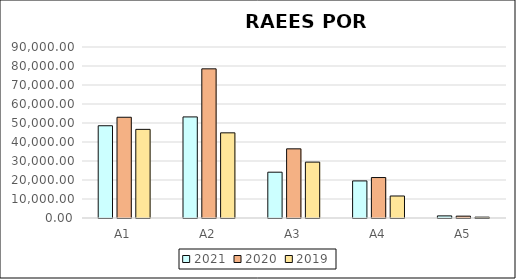
| Category | 2021 | 2020 | 2019 |
|---|---|---|---|
| A1 | 48560 | 53020 | 46650.86 |
| A2 | 53200 | 78510 | 44822.43 |
| A3 | 24105.67 | 36400 | 29415.66 |
| A4 | 19521.33 | 21294 | 11580.8 |
| A5 | 1118 | 973 | 451 |